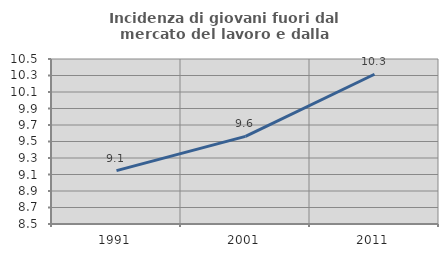
| Category | Incidenza di giovani fuori dal mercato del lavoro e dalla formazione  |
|---|---|
| 1991.0 | 9.147 |
| 2001.0 | 9.562 |
| 2011.0 | 10.315 |